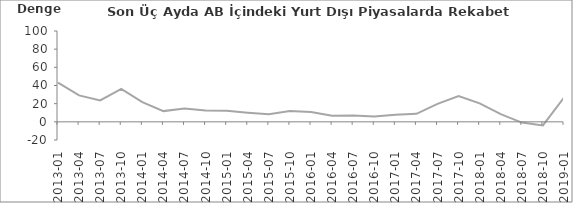
| Category | Son Üç Aydaki AB İçindeki Piyasalarda Rekabet Gücü |
|---|---|
| 2013-01 | 43.2 |
| 2013-04 | 29.1 |
| 2013-07 | 23.6 |
| 2013-10 | 36.3 |
| 2014-01 | 21.7 |
| 2014-04 | 11.8 |
| 2014-07 | 14.7 |
| 2014-10 | 12.6 |
| 2015-01 | 12.1 |
| 2015-04 | 10.1 |
| 2015-07 | 8.3 |
| 2015-10 | 11.9 |
| 2016-01 | 10.9 |
| 2016-04 | 6.8 |
| 2016-07 | 7 |
| 2016-10 | 5.8 |
| 2017-01 | 7.8 |
| 2017-04 | 8.8 |
| 2017-07 | 19.8 |
| 2017-10 | 28.4 |
| 2018-01 | 20.3 |
| 2018-04 | 8.5 |
| 2018-07 | -0.8 |
| 2018-10 | -4 |
| 2019-01 | 26.7 |